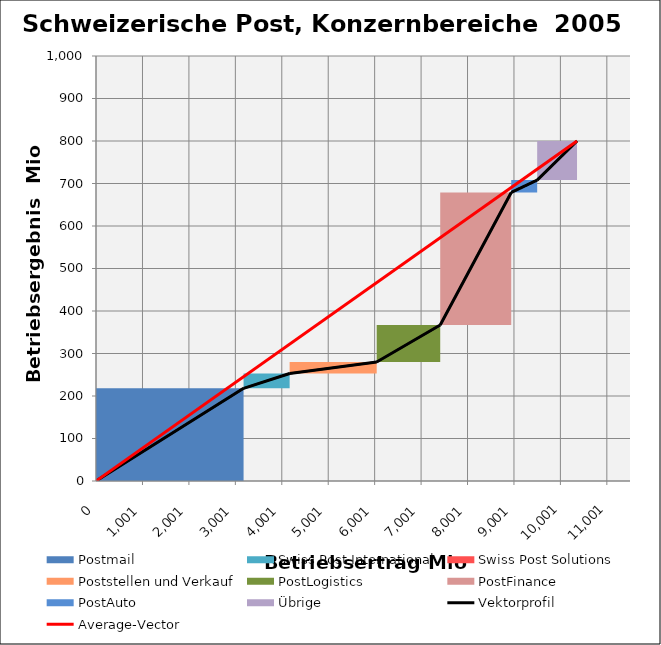
| Category | transparent | Postmail | Swiss Post International | Swiss Post Solutions | Poststellen und Verkauf | PostLogistics | PostFinance | PostAuto | Übrige | Border right & top |
|---|---|---|---|---|---|---|---|---|---|---|
| 0.0 | 0 | 218 | 0 | 0 | 0 | 0 | 0 | 0 | 0 | 0 |
| 3178.0 | 0 | 218 | 0 | 0 | 0 | 0 | 0 | 0 | 0 | 0 |
| 3178.0 | 218 | 0 | 35 | 0 | 0 | 0 | 0 | 0 | 0 | 0 |
| 4170.0 | 218 | 0 | 35 | 0 | 0 | 0 | 0 | 0 | 0 | 0 |
| 4170.0 | 253 | 0 | 0 | 0 | 0 | 0 | 0 | 0 | 0 | 0 |
| 4170.0 | 253 | 0 | 0 | 0 | 0 | 0 | 0 | 0 | 0 | 0 |
| 4170.0 | 253 | 0 | 0 | 0 | 27 | 0 | 0 | 0 | 0 | 0 |
| 6045.0 | 253 | 0 | 0 | 0 | 27 | 0 | 0 | 0 | 0 | 0 |
| 6045.0 | 280 | 0 | 0 | 0 | 0 | 87 | 0 | 0 | 0 | 0 |
| 7413.0 | 280 | 0 | 0 | 0 | 0 | 87 | 0 | 0 | 0 | 0 |
| 7413.0 | 367 | 0 | 0 | 0 | 0 | 0 | 312 | 0 | 0 | 0 |
| 8942.0 | 367 | 0 | 0 | 0 | 0 | 0 | 312 | 0 | 0 | 0 |
| 8942.0 | 679 | 0 | 0 | 0 | 0 | 0 | 0 | 29 | 0 | 0 |
| 9501.0 | 679 | 0 | 0 | 0 | 0 | 0 | 0 | 29 | 0 | 0 |
| 9501.0 | 708 | 0 | 0 | 0 | 0 | 0 | 0 | 0 | 92 | 0 |
| 10359.0 | 708 | 0 | 0 | 0 | 0 | 0 | 0 | 0 | 92 | 0 |
| 10359.0 | 800 | 0 | 0 | 0 | 0 | 0 | 0 | 0 | 0 | 0 |
| 10359.0 | 800 | 0 | 0 | 0 | 0 | 0 | 0 | 0 | 0 | 0 |
| 10359.0 | 800 | 0 | 0 | 0 | 0 | 0 | 0 | 0 | 0 | 0 |
| 10359.0 | 800 | 0 | 0 | 0 | 0 | 0 | 0 | 0 | 0 | 0 |
| 10359.0 | 800 | 0 | 0 | 0 | 0 | 0 | 0 | 0 | 0 | 100 |
| 11500.0 | 800 | 0 | 0 | 0 | 0 | 0 | 0 | 0 | 0 | 100 |
| 11500.0 | 800 | 0 | 0 | 0 | 0 | 0 | 0 | 0 | 0 | 100 |